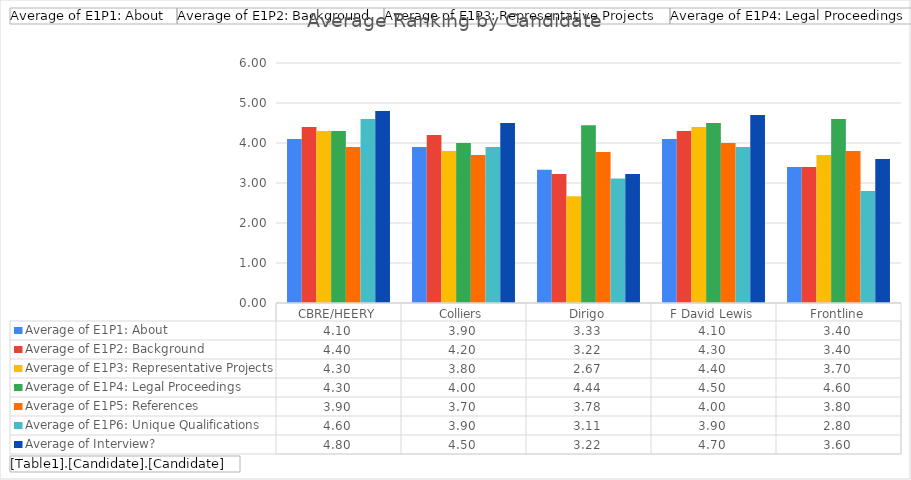
| Category | Average of E1P1: About | Average of E1P2: Background | Average of E1P3: Representative Projects | Average of E1P4: Legal Proceedings | Average of E1P5: References | Average of E1P6: Unique Qualifications | Average of Interview? |
|---|---|---|---|---|---|---|---|
| CBRE/HEERY | 4.1 | 4.4 | 4.3 | 4.3 | 3.9 | 4.6 | 4.8 |
| Colliers | 3.9 | 4.2 | 3.8 | 4 | 3.7 | 3.9 | 4.5 |
| Dirigo | 3.333 | 3.222 | 2.667 | 4.444 | 3.778 | 3.111 | 3.222 |
| F David Lewis | 4.1 | 4.3 | 4.4 | 4.5 | 4 | 3.9 | 4.7 |
| Frontline | 3.4 | 3.4 | 3.7 | 4.6 | 3.8 | 2.8 | 3.6 |